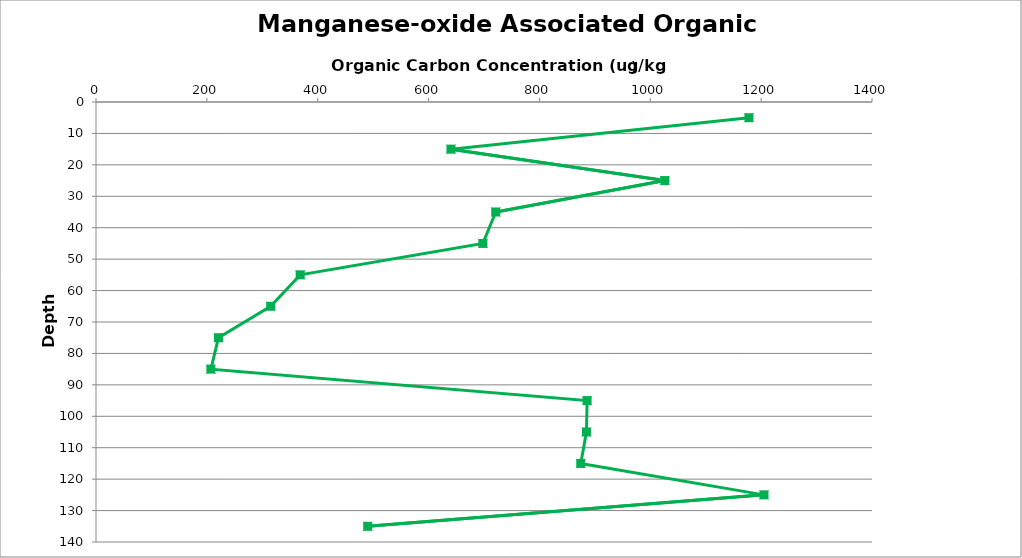
| Category | Mn-ox associated Organic Carbon |
|---|---|
| 1178.0095816727796 | 5 |
| 640.424067812924 | 15 |
| 1026.2953426297597 | 25 |
| 721.1826732374677 | 35 |
| 698.0070585238952 | 45 |
| 368.3601314939434 | 55 |
| 315.1494176876933 | 65 |
| 220.95061178523966 | 75 |
| 207.2448337431214 | 85 |
| 886.0 | 95 |
| 884.8107209163961 | 105 |
| 874.5571591885275 | 115 |
| 1205.1626898973138 | 125 |
| 490.164443922176 | 135 |